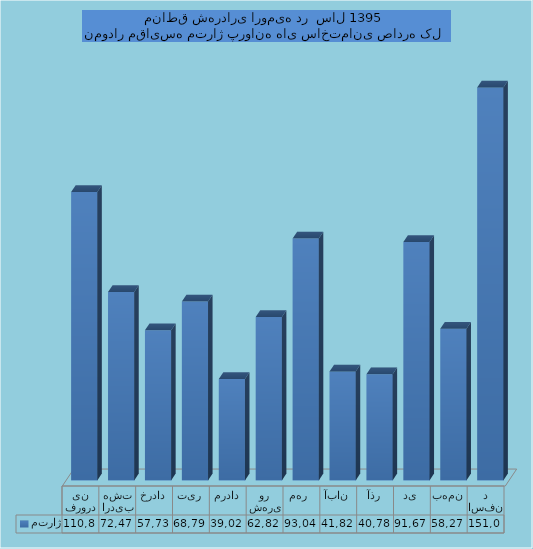
| Category | متراژ |
|---|---|
| فروردین | 110883.31 |
| اردیبهشت | 72471.25 |
| خرداد | 57739.11 |
| تیر | 68796.97 |
| مرداد | 39024.37 |
| شهریور | 62829.3 |
| مهر  | 93040.401 |
| آبان | 41829.02 |
| آذر | 40782.32 |
| دی | 91675.72 |
| بهمن | 58274.55 |
| اسفند | 151074.55 |